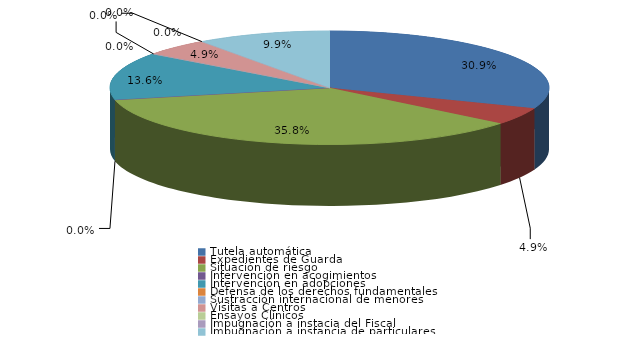
| Category | Series 0 |
|---|---|
| Tutela automática | 25 |
| Expedientes de Guarda | 4 |
| Situación de riesgo | 29 |
| Intervención en acogimientos | 0 |
| Intervención en adopciones | 11 |
| Defensa de los derechos fundamentales | 0 |
| Sustracción internacional de menores | 0 |
| Visitas a Centros | 4 |
| Ensayos Clínicos | 0 |
| Impugnación a instacia del Fiscal | 0 |
| Impugnación a instancia de particulares | 8 |